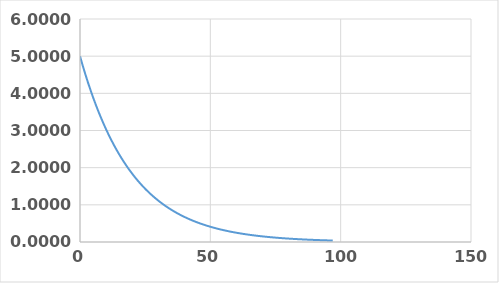
| Category | Series 0 |
|---|---|
| 0.0 | 5 |
| 1.0 | 4.756 |
| 2.0 | 4.524 |
| 3.0 | 4.304 |
| 4.0 | 4.094 |
| 5.0 | 3.894 |
| 6.0 | 3.704 |
| 7.0 | 3.523 |
| 8.0 | 3.352 |
| 9.0 | 3.188 |
| 10.0 | 3.033 |
| 11.0 | 2.885 |
| 12.0 | 2.744 |
| 13.0 | 2.61 |
| 14.0 | 2.483 |
| 15.0 | 2.362 |
| 16.0 | 2.247 |
| 17.0 | 2.137 |
| 18.0 | 2.033 |
| 19.0 | 1.934 |
| 20.0 | 1.839 |
| 21.0 | 1.75 |
| 22.0 | 1.664 |
| 23.0 | 1.583 |
| 24.0 | 1.506 |
| 25.0 | 1.433 |
| 26.0 | 1.363 |
| 27.0 | 1.296 |
| 28.0 | 1.233 |
| 29.0 | 1.173 |
| 30.0 | 1.116 |
| 31.0 | 1.061 |
| 32.0 | 1.009 |
| 33.0 | 0.96 |
| 34.0 | 0.913 |
| 35.0 | 0.869 |
| 36.0 | 0.826 |
| 37.0 | 0.786 |
| 38.0 | 0.748 |
| 39.0 | 0.711 |
| 40.0 | 0.677 |
| 41.0 | 0.644 |
| 42.0 | 0.612 |
| 43.0 | 0.582 |
| 44.0 | 0.554 |
| 45.0 | 0.527 |
| 46.0 | 0.501 |
| 47.0 | 0.477 |
| 48.0 | 0.454 |
| 49.0 | 0.431 |
| 50.0 | 0.41 |
| 51.0 | 0.39 |
| 52.0 | 0.371 |
| 53.0 | 0.353 |
| 54.0 | 0.336 |
| 55.0 | 0.32 |
| 56.0 | 0.304 |
| 57.0 | 0.289 |
| 58.0 | 0.275 |
| 59.0 | 0.262 |
| 60.0 | 0.249 |
| 61.0 | 0.237 |
| 62.0 | 0.225 |
| 63.0 | 0.214 |
| 64.0 | 0.204 |
| 65.0 | 0.194 |
| 66.0 | 0.184 |
| 67.0 | 0.175 |
| 68.0 | 0.167 |
| 69.0 | 0.159 |
| 70.0 | 0.151 |
| 71.0 | 0.144 |
| 72.0 | 0.137 |
| 73.0 | 0.13 |
| 74.0 | 0.124 |
| 75.0 | 0.118 |
| 76.0 | 0.112 |
| 77.0 | 0.106 |
| 78.0 | 0.101 |
| 79.0 | 0.096 |
| 80.0 | 0.092 |
| 81.0 | 0.087 |
| 82.0 | 0.083 |
| 83.0 | 0.079 |
| 84.0 | 0.075 |
| 85.0 | 0.071 |
| 86.0 | 0.068 |
| 87.0 | 0.065 |
| 88.0 | 0.061 |
| 89.0 | 0.058 |
| 90.0 | 0.056 |
| 91.0 | 0.053 |
| 92.0 | 0.05 |
| 93.0 | 0.048 |
| 94.0 | 0.045 |
| 95.0 | 0.043 |
| 96.0 | 0.041 |
| 97.0 | 0.039 |